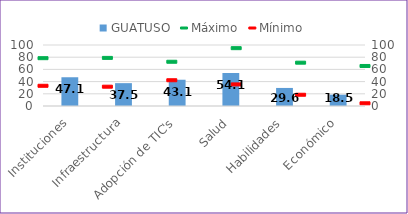
| Category | GUATUSO |
|---|---|
| Instituciones | 47.124 |
| Infraestructura | 37.458 |
| Adopción de TIC's | 43.053 |
| Salud | 54.107 |
| Habilidades | 29.595 |
| Económico | 18.528 |